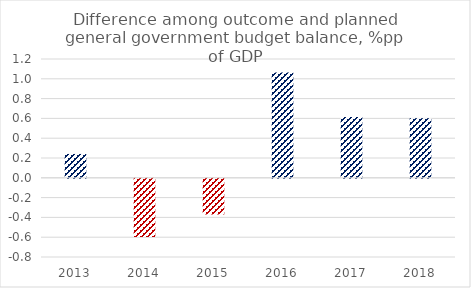
| Category | Series 0 |
|---|---|
| 2013.0 | 0.241 |
| 2014.0 | -0.589 |
| 2015.0 | -0.36 |
| 2016.0 | 1.062 |
| 2017.0 | 0.614 |
| 2018.0 | 0.602 |